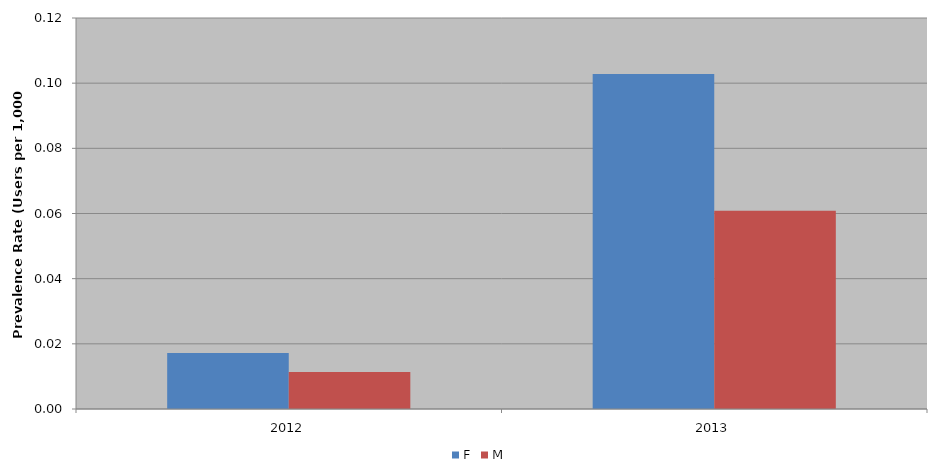
| Category | F | M |
|---|---|---|
| 2012 | 0.017 | 0.011 |
| 2013 | 0.103 | 0.061 |